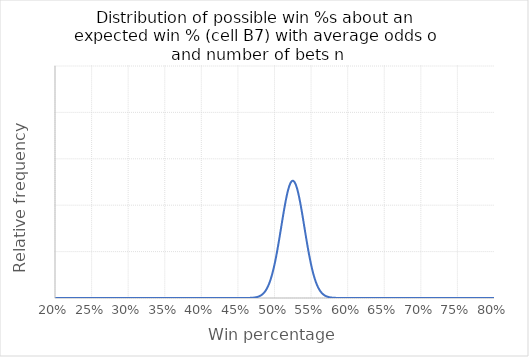
| Category | Probability mass function |
|---|---|
| 0.0 | 0 |
| 0.001 | 0 |
| 0.002 | 0 |
| 0.003 | 0 |
| 0.004 | 0 |
| 0.005 | 0 |
| 0.006 | 0 |
| 0.007 | 0 |
| 0.008 | 0 |
| 0.009000000000000001 | 0 |
| 0.010000000000000002 | 0 |
| 0.011000000000000003 | 0 |
| 0.012000000000000004 | 0 |
| 0.013000000000000005 | 0 |
| 0.014000000000000005 | 0 |
| 0.015000000000000006 | 0 |
| 0.016000000000000007 | 0 |
| 0.017000000000000008 | 0 |
| 0.01800000000000001 | 0 |
| 0.01900000000000001 | 0 |
| 0.02000000000000001 | 0 |
| 0.02100000000000001 | 0 |
| 0.022000000000000013 | 0 |
| 0.023000000000000013 | 0 |
| 0.024000000000000014 | 0 |
| 0.025000000000000015 | 0 |
| 0.026000000000000016 | 0 |
| 0.027000000000000017 | 0 |
| 0.028000000000000018 | 0 |
| 0.02900000000000002 | 0 |
| 0.03000000000000002 | 0 |
| 0.03100000000000002 | 0 |
| 0.03200000000000002 | 0 |
| 0.03300000000000002 | 0 |
| 0.03400000000000002 | 0 |
| 0.035000000000000024 | 0 |
| 0.036000000000000025 | 0 |
| 0.037000000000000026 | 0 |
| 0.03800000000000003 | 0 |
| 0.03900000000000003 | 0 |
| 0.04000000000000003 | 0 |
| 0.04100000000000003 | 0 |
| 0.04200000000000003 | 0 |
| 0.04300000000000003 | 0 |
| 0.04400000000000003 | 0 |
| 0.04500000000000003 | 0 |
| 0.046000000000000034 | 0 |
| 0.047000000000000035 | 0 |
| 0.048000000000000036 | 0 |
| 0.04900000000000004 | 0 |
| 0.05000000000000004 | 0 |
| 0.05100000000000004 | 0 |
| 0.05200000000000004 | 0 |
| 0.05300000000000004 | 0 |
| 0.05400000000000004 | 0 |
| 0.05500000000000004 | 0 |
| 0.05600000000000004 | 0 |
| 0.057000000000000044 | 0 |
| 0.058000000000000045 | 0 |
| 0.059000000000000045 | 0 |
| 0.060000000000000046 | 0 |
| 0.06100000000000005 | 0 |
| 0.06200000000000005 | 0 |
| 0.06300000000000004 | 0 |
| 0.06400000000000004 | 0 |
| 0.06500000000000004 | 0 |
| 0.06600000000000004 | 0 |
| 0.06700000000000005 | 0 |
| 0.06800000000000005 | 0 |
| 0.06900000000000005 | 0 |
| 0.07000000000000005 | 0 |
| 0.07100000000000005 | 0 |
| 0.07200000000000005 | 0 |
| 0.07300000000000005 | 0 |
| 0.07400000000000005 | 0 |
| 0.07500000000000005 | 0 |
| 0.07600000000000005 | 0 |
| 0.07700000000000005 | 0 |
| 0.07800000000000006 | 0 |
| 0.07900000000000006 | 0 |
| 0.08000000000000006 | 0 |
| 0.08100000000000006 | 0 |
| 0.08200000000000006 | 0 |
| 0.08300000000000006 | 0 |
| 0.08400000000000006 | 0 |
| 0.08500000000000006 | 0 |
| 0.08600000000000006 | 0 |
| 0.08700000000000006 | 0 |
| 0.08800000000000006 | 0 |
| 0.08900000000000007 | 0 |
| 0.09000000000000007 | 0 |
| 0.09100000000000007 | 0 |
| 0.09200000000000007 | 0 |
| 0.09300000000000007 | 0 |
| 0.09400000000000007 | 0 |
| 0.09500000000000007 | 0 |
| 0.09600000000000007 | 0 |
| 0.09700000000000007 | 0 |
| 0.09800000000000007 | 0 |
| 0.09900000000000007 | 0 |
| 0.10000000000000007 | 0 |
| 0.10100000000000008 | 0 |
| 0.10200000000000008 | 0 |
| 0.10300000000000008 | 0 |
| 0.10400000000000008 | 0 |
| 0.10500000000000008 | 0 |
| 0.10600000000000008 | 0 |
| 0.10700000000000008 | 0 |
| 0.10800000000000008 | 0 |
| 0.10900000000000008 | 0 |
| 0.11000000000000008 | 0 |
| 0.11100000000000008 | 0 |
| 0.11200000000000009 | 0 |
| 0.11300000000000009 | 0 |
| 0.11400000000000009 | 0 |
| 0.11500000000000009 | 0 |
| 0.11600000000000009 | 0 |
| 0.11700000000000009 | 0 |
| 0.11800000000000009 | 0 |
| 0.11900000000000009 | 0 |
| 0.12000000000000009 | 0 |
| 0.1210000000000001 | 0 |
| 0.1220000000000001 | 0 |
| 0.1230000000000001 | 0 |
| 0.1240000000000001 | 0 |
| 0.12500000000000008 | 0 |
| 0.12600000000000008 | 0 |
| 0.12700000000000009 | 0 |
| 0.12800000000000009 | 0 |
| 0.1290000000000001 | 0 |
| 0.1300000000000001 | 0 |
| 0.1310000000000001 | 0 |
| 0.1320000000000001 | 0 |
| 0.1330000000000001 | 0 |
| 0.1340000000000001 | 0 |
| 0.1350000000000001 | 0 |
| 0.1360000000000001 | 0 |
| 0.1370000000000001 | 0 |
| 0.1380000000000001 | 0 |
| 0.1390000000000001 | 0 |
| 0.1400000000000001 | 0 |
| 0.1410000000000001 | 0 |
| 0.1420000000000001 | 0 |
| 0.1430000000000001 | 0 |
| 0.1440000000000001 | 0 |
| 0.1450000000000001 | 0 |
| 0.1460000000000001 | 0 |
| 0.1470000000000001 | 0 |
| 0.1480000000000001 | 0 |
| 0.1490000000000001 | 0 |
| 0.1500000000000001 | 0 |
| 0.1510000000000001 | 0 |
| 0.1520000000000001 | 0 |
| 0.1530000000000001 | 0 |
| 0.1540000000000001 | 0 |
| 0.1550000000000001 | 0 |
| 0.1560000000000001 | 0 |
| 0.1570000000000001 | 0 |
| 0.1580000000000001 | 0 |
| 0.1590000000000001 | 0 |
| 0.16000000000000011 | 0 |
| 0.16100000000000012 | 0 |
| 0.16200000000000012 | 0 |
| 0.16300000000000012 | 0 |
| 0.16400000000000012 | 0 |
| 0.16500000000000012 | 0 |
| 0.16600000000000012 | 0 |
| 0.16700000000000012 | 0 |
| 0.16800000000000012 | 0 |
| 0.16900000000000012 | 0 |
| 0.17000000000000012 | 0 |
| 0.17100000000000012 | 0 |
| 0.17200000000000013 | 0 |
| 0.17300000000000013 | 0 |
| 0.17400000000000013 | 0 |
| 0.17500000000000013 | 0 |
| 0.17600000000000013 | 0 |
| 0.17700000000000013 | 0 |
| 0.17800000000000013 | 0 |
| 0.17900000000000013 | 0 |
| 0.18000000000000013 | 0 |
| 0.18100000000000013 | 0 |
| 0.18200000000000013 | 0 |
| 0.18300000000000013 | 0 |
| 0.18400000000000014 | 0 |
| 0.18500000000000014 | 0 |
| 0.18600000000000014 | 0 |
| 0.18700000000000014 | 0 |
| 0.18800000000000014 | 0 |
| 0.18900000000000014 | 0 |
| 0.19000000000000014 | 0 |
| 0.19100000000000014 | 0 |
| 0.19200000000000014 | 0 |
| 0.19300000000000014 | 0 |
| 0.19400000000000014 | 0 |
| 0.19500000000000015 | 0 |
| 0.19600000000000015 | 0 |
| 0.19700000000000015 | 0 |
| 0.19800000000000015 | 0 |
| 0.19900000000000015 | 0 |
| 0.20000000000000015 | 0 |
| 0.20100000000000015 | 0 |
| 0.20200000000000015 | 0 |
| 0.20300000000000015 | 0 |
| 0.20400000000000015 | 0 |
| 0.20500000000000015 | 0 |
| 0.20600000000000016 | 0 |
| 0.20700000000000016 | 0 |
| 0.20800000000000016 | 0 |
| 0.20900000000000016 | 0 |
| 0.21000000000000016 | 0 |
| 0.21100000000000016 | 0 |
| 0.21200000000000016 | 0 |
| 0.21300000000000016 | 0 |
| 0.21400000000000016 | 0 |
| 0.21500000000000016 | 0 |
| 0.21600000000000016 | 0 |
| 0.21700000000000016 | 0 |
| 0.21800000000000017 | 0 |
| 0.21900000000000017 | 0 |
| 0.22000000000000017 | 0 |
| 0.22100000000000017 | 0 |
| 0.22200000000000017 | 0 |
| 0.22300000000000017 | 0 |
| 0.22400000000000017 | 0 |
| 0.22500000000000017 | 0 |
| 0.22600000000000017 | 0 |
| 0.22700000000000017 | 0 |
| 0.22800000000000017 | 0 |
| 0.22900000000000018 | 0 |
| 0.23000000000000018 | 0 |
| 0.23100000000000018 | 0 |
| 0.23200000000000018 | 0 |
| 0.23300000000000018 | 0 |
| 0.23400000000000018 | 0 |
| 0.23500000000000018 | 0 |
| 0.23600000000000018 | 0 |
| 0.23700000000000018 | 0 |
| 0.23800000000000018 | 0 |
| 0.23900000000000018 | 0 |
| 0.24000000000000019 | 0 |
| 0.2410000000000002 | 0 |
| 0.2420000000000002 | 0 |
| 0.2430000000000002 | 0 |
| 0.2440000000000002 | 0 |
| 0.2450000000000002 | 0 |
| 0.2460000000000002 | 0 |
| 0.2470000000000002 | 0 |
| 0.2480000000000002 | 0 |
| 0.2490000000000002 | 0 |
| 0.25000000000000017 | 0 |
| 0.25100000000000017 | 0 |
| 0.25200000000000017 | 0 |
| 0.25300000000000017 | 0 |
| 0.25400000000000017 | 0 |
| 0.25500000000000017 | 0 |
| 0.25600000000000017 | 0 |
| 0.2570000000000002 | 0 |
| 0.2580000000000002 | 0 |
| 0.2590000000000002 | 0 |
| 0.2600000000000002 | 0 |
| 0.2610000000000002 | 0 |
| 0.2620000000000002 | 0 |
| 0.2630000000000002 | 0 |
| 0.2640000000000002 | 0 |
| 0.2650000000000002 | 0 |
| 0.2660000000000002 | 0 |
| 0.2670000000000002 | 0 |
| 0.2680000000000002 | 0 |
| 0.2690000000000002 | 0 |
| 0.2700000000000002 | 0 |
| 0.2710000000000002 | 0 |
| 0.2720000000000002 | 0 |
| 0.2730000000000002 | 0 |
| 0.2740000000000002 | 0 |
| 0.2750000000000002 | 0 |
| 0.2760000000000002 | 0 |
| 0.2770000000000002 | 0 |
| 0.2780000000000002 | 0 |
| 0.2790000000000002 | 0 |
| 0.2800000000000002 | 0 |
| 0.2810000000000002 | 0 |
| 0.2820000000000002 | 0 |
| 0.2830000000000002 | 0 |
| 0.2840000000000002 | 0 |
| 0.2850000000000002 | 0 |
| 0.2860000000000002 | 0 |
| 0.2870000000000002 | 0 |
| 0.2880000000000002 | 0 |
| 0.2890000000000002 | 0 |
| 0.2900000000000002 | 0 |
| 0.2910000000000002 | 0 |
| 0.2920000000000002 | 0 |
| 0.2930000000000002 | 0 |
| 0.2940000000000002 | 0 |
| 0.2950000000000002 | 0 |
| 0.2960000000000002 | 0 |
| 0.2970000000000002 | 0 |
| 0.2980000000000002 | 0 |
| 0.2990000000000002 | 0 |
| 0.3000000000000002 | 0 |
| 0.3010000000000002 | 0 |
| 0.3020000000000002 | 0 |
| 0.3030000000000002 | 0 |
| 0.3040000000000002 | 0 |
| 0.3050000000000002 | 0 |
| 0.3060000000000002 | 0 |
| 0.3070000000000002 | 0 |
| 0.3080000000000002 | 0 |
| 0.3090000000000002 | 0 |
| 0.3100000000000002 | 0 |
| 0.3110000000000002 | 0 |
| 0.3120000000000002 | 0 |
| 0.3130000000000002 | 0 |
| 0.3140000000000002 | 0 |
| 0.3150000000000002 | 0 |
| 0.3160000000000002 | 0 |
| 0.3170000000000002 | 0 |
| 0.3180000000000002 | 0 |
| 0.31900000000000023 | 0 |
| 0.32000000000000023 | 0 |
| 0.32100000000000023 | 0 |
| 0.32200000000000023 | 0 |
| 0.32300000000000023 | 0 |
| 0.32400000000000023 | 0 |
| 0.32500000000000023 | 0 |
| 0.32600000000000023 | 0 |
| 0.32700000000000023 | 0 |
| 0.32800000000000024 | 0 |
| 0.32900000000000024 | 0 |
| 0.33000000000000024 | 0 |
| 0.33100000000000024 | 0 |
| 0.33200000000000024 | 0 |
| 0.33300000000000024 | 0 |
| 0.33400000000000024 | 0 |
| 0.33500000000000024 | 0 |
| 0.33600000000000024 | 0 |
| 0.33700000000000024 | 0 |
| 0.33800000000000024 | 0 |
| 0.33900000000000025 | 0 |
| 0.34000000000000025 | 0 |
| 0.34100000000000025 | 0 |
| 0.34200000000000025 | 0 |
| 0.34300000000000025 | 0 |
| 0.34400000000000025 | 0 |
| 0.34500000000000025 | 0 |
| 0.34600000000000025 | 0 |
| 0.34700000000000025 | 0 |
| 0.34800000000000025 | 0 |
| 0.34900000000000025 | 0 |
| 0.35000000000000026 | 0 |
| 0.35100000000000026 | 0 |
| 0.35200000000000026 | 0 |
| 0.35300000000000026 | 0 |
| 0.35400000000000026 | 0 |
| 0.35500000000000026 | 0 |
| 0.35600000000000026 | 0 |
| 0.35700000000000026 | 0 |
| 0.35800000000000026 | 0 |
| 0.35900000000000026 | 0 |
| 0.36000000000000026 | 0 |
| 0.36100000000000027 | 0 |
| 0.36200000000000027 | 0 |
| 0.36300000000000027 | 0 |
| 0.36400000000000027 | 0 |
| 0.36500000000000027 | 0 |
| 0.36600000000000027 | 0 |
| 0.36700000000000027 | 0 |
| 0.36800000000000027 | 0 |
| 0.36900000000000027 | 0 |
| 0.3700000000000003 | 0 |
| 0.3710000000000003 | 0 |
| 0.3720000000000003 | 0 |
| 0.3730000000000003 | 0 |
| 0.3740000000000003 | 0 |
| 0.3750000000000003 | 0 |
| 0.3760000000000003 | 0 |
| 0.3770000000000003 | 0 |
| 0.3780000000000003 | 0 |
| 0.3790000000000003 | 0 |
| 0.3800000000000003 | 0 |
| 0.3810000000000003 | 0 |
| 0.3820000000000003 | 0 |
| 0.3830000000000003 | 0 |
| 0.3840000000000003 | 0 |
| 0.3850000000000003 | 0 |
| 0.3860000000000003 | 0 |
| 0.3870000000000003 | 0 |
| 0.3880000000000003 | 0 |
| 0.3890000000000003 | 0 |
| 0.3900000000000003 | 0 |
| 0.3910000000000003 | 0 |
| 0.3920000000000003 | 0 |
| 0.3930000000000003 | 0 |
| 0.3940000000000003 | 0 |
| 0.3950000000000003 | 0 |
| 0.3960000000000003 | 0 |
| 0.3970000000000003 | 0 |
| 0.3980000000000003 | 0 |
| 0.3990000000000003 | 0 |
| 0.4000000000000003 | 0 |
| 0.4010000000000003 | 0 |
| 0.4020000000000003 | 0 |
| 0.4030000000000003 | 0 |
| 0.4040000000000003 | 0 |
| 0.4050000000000003 | 0 |
| 0.4060000000000003 | 0 |
| 0.4070000000000003 | 0 |
| 0.4080000000000003 | 0 |
| 0.4090000000000003 | 0 |
| 0.4100000000000003 | 0 |
| 0.4110000000000003 | 0 |
| 0.4120000000000003 | 0 |
| 0.4130000000000003 | 0 |
| 0.4140000000000003 | 0 |
| 0.4150000000000003 | 0 |
| 0.4160000000000003 | 0 |
| 0.4170000000000003 | 0 |
| 0.4180000000000003 | 0 |
| 0.4190000000000003 | 0 |
| 0.4200000000000003 | 0 |
| 0.4210000000000003 | 0 |
| 0.4220000000000003 | 0 |
| 0.4230000000000003 | 0 |
| 0.4240000000000003 | 0 |
| 0.4250000000000003 | 0 |
| 0.4260000000000003 | 0 |
| 0.4270000000000003 | 0 |
| 0.4280000000000003 | 0 |
| 0.4290000000000003 | 0 |
| 0.4300000000000003 | 0 |
| 0.4310000000000003 | 0 |
| 0.43200000000000033 | 0 |
| 0.43300000000000033 | 0 |
| 0.43400000000000033 | 0 |
| 0.43500000000000033 | 0 |
| 0.43600000000000033 | 0 |
| 0.43700000000000033 | 0 |
| 0.43800000000000033 | 0 |
| 0.43900000000000033 | 0 |
| 0.44000000000000034 | 0 |
| 0.44100000000000034 | 0 |
| 0.44200000000000034 | 0 |
| 0.44300000000000034 | 0 |
| 0.44400000000000034 | 0 |
| 0.44500000000000034 | 0 |
| 0.44600000000000034 | 0 |
| 0.44700000000000034 | 0 |
| 0.44800000000000034 | 0 |
| 0.44900000000000034 | 0 |
| 0.45000000000000034 | 0 |
| 0.45100000000000035 | 0 |
| 0.45200000000000035 | 0 |
| 0.45300000000000035 | 0 |
| 0.45400000000000035 | 0 |
| 0.45500000000000035 | 0 |
| 0.45600000000000035 | 0 |
| 0.45700000000000035 | 0 |
| 0.45800000000000035 | 0 |
| 0.45900000000000035 | 0 |
| 0.46000000000000035 | 0 |
| 0.46100000000000035 | 0 |
| 0.46200000000000035 | 0 |
| 0.46300000000000036 | 0 |
| 0.46400000000000036 | 0 |
| 0.46500000000000036 | 0 |
| 0.46600000000000036 | 0 |
| 0.46700000000000036 | 0 |
| 0.46800000000000036 | 0 |
| 0.46900000000000036 | 0 |
| 0.47000000000000036 | 0 |
| 0.47100000000000036 | 0 |
| 0.47200000000000036 | 0 |
| 0.47300000000000036 | 0 |
| 0.47400000000000037 | 0 |
| 0.47500000000000037 | 0 |
| 0.47600000000000037 | 0 |
| 0.47700000000000037 | 0 |
| 0.47800000000000037 | 0 |
| 0.47900000000000037 | 0 |
| 0.48000000000000037 | 0 |
| 0.48100000000000037 | 0.001 |
| 0.4820000000000004 | 0.001 |
| 0.4830000000000004 | 0.001 |
| 0.4840000000000004 | 0.001 |
| 0.4850000000000004 | 0.001 |
| 0.4860000000000004 | 0.001 |
| 0.4870000000000004 | 0.001 |
| 0.4880000000000004 | 0.002 |
| 0.4890000000000004 | 0.002 |
| 0.4900000000000004 | 0.002 |
| 0.4910000000000004 | 0.002 |
| 0.4920000000000004 | 0.003 |
| 0.4930000000000004 | 0.003 |
| 0.4940000000000004 | 0.004 |
| 0.4950000000000004 | 0.004 |
| 0.4960000000000004 | 0.005 |
| 0.4970000000000004 | 0.005 |
| 0.4980000000000004 | 0.006 |
| 0.4990000000000004 | 0.007 |
| 0.5000000000000003 | 0.007 |
| 0.5010000000000003 | 0.008 |
| 0.5020000000000003 | 0.009 |
| 0.5030000000000003 | 0.01 |
| 0.5040000000000003 | 0.01 |
| 0.5050000000000003 | 0.011 |
| 0.5060000000000003 | 0.012 |
| 0.5070000000000003 | 0.013 |
| 0.5080000000000003 | 0.014 |
| 0.5090000000000003 | 0.015 |
| 0.5100000000000003 | 0.016 |
| 0.5110000000000003 | 0.017 |
| 0.5120000000000003 | 0.018 |
| 0.5130000000000003 | 0.019 |
| 0.5140000000000003 | 0.02 |
| 0.5150000000000003 | 0.021 |
| 0.5160000000000003 | 0.021 |
| 0.5170000000000003 | 0.022 |
| 0.5180000000000003 | 0.023 |
| 0.5190000000000003 | 0.024 |
| 0.5200000000000004 | 0.024 |
| 0.5210000000000004 | 0.024 |
| 0.5220000000000004 | 0.025 |
| 0.5230000000000004 | 0.025 |
| 0.5240000000000004 | 0.025 |
| 0.5250000000000004 | 0.025 |
| 0.5260000000000004 | 0.025 |
| 0.5270000000000004 | 0.025 |
| 0.5280000000000004 | 0.025 |
| 0.5290000000000004 | 0.024 |
| 0.5300000000000004 | 0.024 |
| 0.5310000000000004 | 0.024 |
| 0.5320000000000004 | 0.023 |
| 0.5330000000000004 | 0.022 |
| 0.5340000000000004 | 0.021 |
| 0.5350000000000004 | 0.021 |
| 0.5360000000000004 | 0.02 |
| 0.5370000000000004 | 0.019 |
| 0.5380000000000004 | 0.018 |
| 0.5390000000000004 | 0.017 |
| 0.5400000000000004 | 0.016 |
| 0.5410000000000004 | 0.015 |
| 0.5420000000000004 | 0.014 |
| 0.5430000000000004 | 0.013 |
| 0.5440000000000004 | 0.012 |
| 0.5450000000000004 | 0.011 |
| 0.5460000000000004 | 0.01 |
| 0.5470000000000004 | 0.01 |
| 0.5480000000000004 | 0.009 |
| 0.5490000000000004 | 0.008 |
| 0.5500000000000004 | 0.007 |
| 0.5510000000000004 | 0.007 |
| 0.5520000000000004 | 0.006 |
| 0.5530000000000004 | 0.005 |
| 0.5540000000000004 | 0.005 |
| 0.5550000000000004 | 0.004 |
| 0.5560000000000004 | 0.004 |
| 0.5570000000000004 | 0.003 |
| 0.5580000000000004 | 0.003 |
| 0.5590000000000004 | 0.002 |
| 0.5600000000000004 | 0.002 |
| 0.5610000000000004 | 0.002 |
| 0.5620000000000004 | 0.002 |
| 0.5630000000000004 | 0.001 |
| 0.5640000000000004 | 0.001 |
| 0.5650000000000004 | 0.001 |
| 0.5660000000000004 | 0.001 |
| 0.5670000000000004 | 0.001 |
| 0.5680000000000004 | 0.001 |
| 0.5690000000000004 | 0.001 |
| 0.5700000000000004 | 0 |
| 0.5710000000000004 | 0 |
| 0.5720000000000004 | 0 |
| 0.5730000000000004 | 0 |
| 0.5740000000000004 | 0 |
| 0.5750000000000004 | 0 |
| 0.5760000000000004 | 0 |
| 0.5770000000000004 | 0 |
| 0.5780000000000004 | 0 |
| 0.5790000000000004 | 0 |
| 0.5800000000000004 | 0 |
| 0.5810000000000004 | 0 |
| 0.5820000000000004 | 0 |
| 0.5830000000000004 | 0 |
| 0.5840000000000004 | 0 |
| 0.5850000000000004 | 0 |
| 0.5860000000000004 | 0 |
| 0.5870000000000004 | 0 |
| 0.5880000000000004 | 0 |
| 0.5890000000000004 | 0 |
| 0.5900000000000004 | 0 |
| 0.5910000000000004 | 0 |
| 0.5920000000000004 | 0 |
| 0.5930000000000004 | 0 |
| 0.5940000000000004 | 0 |
| 0.5950000000000004 | 0 |
| 0.5960000000000004 | 0 |
| 0.5970000000000004 | 0 |
| 0.5980000000000004 | 0 |
| 0.5990000000000004 | 0 |
| 0.6000000000000004 | 0 |
| 0.6010000000000004 | 0 |
| 0.6020000000000004 | 0 |
| 0.6030000000000004 | 0 |
| 0.6040000000000004 | 0 |
| 0.6050000000000004 | 0 |
| 0.6060000000000004 | 0 |
| 0.6070000000000004 | 0 |
| 0.6080000000000004 | 0 |
| 0.6090000000000004 | 0 |
| 0.6100000000000004 | 0 |
| 0.6110000000000004 | 0 |
| 0.6120000000000004 | 0 |
| 0.6130000000000004 | 0 |
| 0.6140000000000004 | 0 |
| 0.6150000000000004 | 0 |
| 0.6160000000000004 | 0 |
| 0.6170000000000004 | 0 |
| 0.6180000000000004 | 0 |
| 0.6190000000000004 | 0 |
| 0.6200000000000004 | 0 |
| 0.6210000000000004 | 0 |
| 0.6220000000000004 | 0 |
| 0.6230000000000004 | 0 |
| 0.6240000000000004 | 0 |
| 0.6250000000000004 | 0 |
| 0.6260000000000004 | 0 |
| 0.6270000000000004 | 0 |
| 0.6280000000000004 | 0 |
| 0.6290000000000004 | 0 |
| 0.6300000000000004 | 0 |
| 0.6310000000000004 | 0 |
| 0.6320000000000005 | 0 |
| 0.6330000000000005 | 0 |
| 0.6340000000000005 | 0 |
| 0.6350000000000005 | 0 |
| 0.6360000000000005 | 0 |
| 0.6370000000000005 | 0 |
| 0.6380000000000005 | 0 |
| 0.6390000000000005 | 0 |
| 0.6400000000000005 | 0 |
| 0.6410000000000005 | 0 |
| 0.6420000000000005 | 0 |
| 0.6430000000000005 | 0 |
| 0.6440000000000005 | 0 |
| 0.6450000000000005 | 0 |
| 0.6460000000000005 | 0 |
| 0.6470000000000005 | 0 |
| 0.6480000000000005 | 0 |
| 0.6490000000000005 | 0 |
| 0.6500000000000005 | 0 |
| 0.6510000000000005 | 0 |
| 0.6520000000000005 | 0 |
| 0.6530000000000005 | 0 |
| 0.6540000000000005 | 0 |
| 0.6550000000000005 | 0 |
| 0.6560000000000005 | 0 |
| 0.6570000000000005 | 0 |
| 0.6580000000000005 | 0 |
| 0.6590000000000005 | 0 |
| 0.6600000000000005 | 0 |
| 0.6610000000000005 | 0 |
| 0.6620000000000005 | 0 |
| 0.6630000000000005 | 0 |
| 0.6640000000000005 | 0 |
| 0.6650000000000005 | 0 |
| 0.6660000000000005 | 0 |
| 0.6670000000000005 | 0 |
| 0.6680000000000005 | 0 |
| 0.6690000000000005 | 0 |
| 0.6700000000000005 | 0 |
| 0.6710000000000005 | 0 |
| 0.6720000000000005 | 0 |
| 0.6730000000000005 | 0 |
| 0.6740000000000005 | 0 |
| 0.6750000000000005 | 0 |
| 0.6760000000000005 | 0 |
| 0.6770000000000005 | 0 |
| 0.6780000000000005 | 0 |
| 0.6790000000000005 | 0 |
| 0.6800000000000005 | 0 |
| 0.6810000000000005 | 0 |
| 0.6820000000000005 | 0 |
| 0.6830000000000005 | 0 |
| 0.6840000000000005 | 0 |
| 0.6850000000000005 | 0 |
| 0.6860000000000005 | 0 |
| 0.6870000000000005 | 0 |
| 0.6880000000000005 | 0 |
| 0.6890000000000005 | 0 |
| 0.6900000000000005 | 0 |
| 0.6910000000000005 | 0 |
| 0.6920000000000005 | 0 |
| 0.6930000000000005 | 0 |
| 0.6940000000000005 | 0 |
| 0.6950000000000005 | 0 |
| 0.6960000000000005 | 0 |
| 0.6970000000000005 | 0 |
| 0.6980000000000005 | 0 |
| 0.6990000000000005 | 0 |
| 0.7000000000000005 | 0 |
| 0.7010000000000005 | 0 |
| 0.7020000000000005 | 0 |
| 0.7030000000000005 | 0 |
| 0.7040000000000005 | 0 |
| 0.7050000000000005 | 0 |
| 0.7060000000000005 | 0 |
| 0.7070000000000005 | 0 |
| 0.7080000000000005 | 0 |
| 0.7090000000000005 | 0 |
| 0.7100000000000005 | 0 |
| 0.7110000000000005 | 0 |
| 0.7120000000000005 | 0 |
| 0.7130000000000005 | 0 |
| 0.7140000000000005 | 0 |
| 0.7150000000000005 | 0 |
| 0.7160000000000005 | 0 |
| 0.7170000000000005 | 0 |
| 0.7180000000000005 | 0 |
| 0.7190000000000005 | 0 |
| 0.7200000000000005 | 0 |
| 0.7210000000000005 | 0 |
| 0.7220000000000005 | 0 |
| 0.7230000000000005 | 0 |
| 0.7240000000000005 | 0 |
| 0.7250000000000005 | 0 |
| 0.7260000000000005 | 0 |
| 0.7270000000000005 | 0 |
| 0.7280000000000005 | 0 |
| 0.7290000000000005 | 0 |
| 0.7300000000000005 | 0 |
| 0.7310000000000005 | 0 |
| 0.7320000000000005 | 0 |
| 0.7330000000000005 | 0 |
| 0.7340000000000005 | 0 |
| 0.7350000000000005 | 0 |
| 0.7360000000000005 | 0 |
| 0.7370000000000005 | 0 |
| 0.7380000000000005 | 0 |
| 0.7390000000000005 | 0 |
| 0.7400000000000005 | 0 |
| 0.7410000000000005 | 0 |
| 0.7420000000000005 | 0 |
| 0.7430000000000005 | 0 |
| 0.7440000000000005 | 0 |
| 0.7450000000000006 | 0 |
| 0.7460000000000006 | 0 |
| 0.7470000000000006 | 0 |
| 0.7480000000000006 | 0 |
| 0.7490000000000006 | 0 |
| 0.7500000000000006 | 0 |
| 0.7510000000000006 | 0 |
| 0.7520000000000006 | 0 |
| 0.7530000000000006 | 0 |
| 0.7540000000000006 | 0 |
| 0.7550000000000006 | 0 |
| 0.7560000000000006 | 0 |
| 0.7570000000000006 | 0 |
| 0.7580000000000006 | 0 |
| 0.7590000000000006 | 0 |
| 0.7600000000000006 | 0 |
| 0.7610000000000006 | 0 |
| 0.7620000000000006 | 0 |
| 0.7630000000000006 | 0 |
| 0.7640000000000006 | 0 |
| 0.7650000000000006 | 0 |
| 0.7660000000000006 | 0 |
| 0.7670000000000006 | 0 |
| 0.7680000000000006 | 0 |
| 0.7690000000000006 | 0 |
| 0.7700000000000006 | 0 |
| 0.7710000000000006 | 0 |
| 0.7720000000000006 | 0 |
| 0.7730000000000006 | 0 |
| 0.7740000000000006 | 0 |
| 0.7750000000000006 | 0 |
| 0.7760000000000006 | 0 |
| 0.7770000000000006 | 0 |
| 0.7780000000000006 | 0 |
| 0.7790000000000006 | 0 |
| 0.7800000000000006 | 0 |
| 0.7810000000000006 | 0 |
| 0.7820000000000006 | 0 |
| 0.7830000000000006 | 0 |
| 0.7840000000000006 | 0 |
| 0.7850000000000006 | 0 |
| 0.7860000000000006 | 0 |
| 0.7870000000000006 | 0 |
| 0.7880000000000006 | 0 |
| 0.7890000000000006 | 0 |
| 0.7900000000000006 | 0 |
| 0.7910000000000006 | 0 |
| 0.7920000000000006 | 0 |
| 0.7930000000000006 | 0 |
| 0.7940000000000006 | 0 |
| 0.7950000000000006 | 0 |
| 0.7960000000000006 | 0 |
| 0.7970000000000006 | 0 |
| 0.7980000000000006 | 0 |
| 0.7990000000000006 | 0 |
| 0.8000000000000006 | 0 |
| 0.8010000000000006 | 0 |
| 0.8020000000000006 | 0 |
| 0.8030000000000006 | 0 |
| 0.8040000000000006 | 0 |
| 0.8050000000000006 | 0 |
| 0.8060000000000006 | 0 |
| 0.8070000000000006 | 0 |
| 0.8080000000000006 | 0 |
| 0.8090000000000006 | 0 |
| 0.8100000000000006 | 0 |
| 0.8110000000000006 | 0 |
| 0.8120000000000006 | 0 |
| 0.8130000000000006 | 0 |
| 0.8140000000000006 | 0 |
| 0.8150000000000006 | 0 |
| 0.8160000000000006 | 0 |
| 0.8170000000000006 | 0 |
| 0.8180000000000006 | 0 |
| 0.8190000000000006 | 0 |
| 0.8200000000000006 | 0 |
| 0.8210000000000006 | 0 |
| 0.8220000000000006 | 0 |
| 0.8230000000000006 | 0 |
| 0.8240000000000006 | 0 |
| 0.8250000000000006 | 0 |
| 0.8260000000000006 | 0 |
| 0.8270000000000006 | 0 |
| 0.8280000000000006 | 0 |
| 0.8290000000000006 | 0 |
| 0.8300000000000006 | 0 |
| 0.8310000000000006 | 0 |
| 0.8320000000000006 | 0 |
| 0.8330000000000006 | 0 |
| 0.8340000000000006 | 0 |
| 0.8350000000000006 | 0 |
| 0.8360000000000006 | 0 |
| 0.8370000000000006 | 0 |
| 0.8380000000000006 | 0 |
| 0.8390000000000006 | 0 |
| 0.8400000000000006 | 0 |
| 0.8410000000000006 | 0 |
| 0.8420000000000006 | 0 |
| 0.8430000000000006 | 0 |
| 0.8440000000000006 | 0 |
| 0.8450000000000006 | 0 |
| 0.8460000000000006 | 0 |
| 0.8470000000000006 | 0 |
| 0.8480000000000006 | 0 |
| 0.8490000000000006 | 0 |
| 0.8500000000000006 | 0 |
| 0.8510000000000006 | 0 |
| 0.8520000000000006 | 0 |
| 0.8530000000000006 | 0 |
| 0.8540000000000006 | 0 |
| 0.8550000000000006 | 0 |
| 0.8560000000000006 | 0 |
| 0.8570000000000007 | 0 |
| 0.8580000000000007 | 0 |
| 0.8590000000000007 | 0 |
| 0.8600000000000007 | 0 |
| 0.8610000000000007 | 0 |
| 0.8620000000000007 | 0 |
| 0.8630000000000007 | 0 |
| 0.8640000000000007 | 0 |
| 0.8650000000000007 | 0 |
| 0.8660000000000007 | 0 |
| 0.8670000000000007 | 0 |
| 0.8680000000000007 | 0 |
| 0.8690000000000007 | 0 |
| 0.8700000000000007 | 0 |
| 0.8710000000000007 | 0 |
| 0.8720000000000007 | 0 |
| 0.8730000000000007 | 0 |
| 0.8740000000000007 | 0 |
| 0.8750000000000007 | 0 |
| 0.8760000000000007 | 0 |
| 0.8770000000000007 | 0 |
| 0.8780000000000007 | 0 |
| 0.8790000000000007 | 0 |
| 0.8800000000000007 | 0 |
| 0.8810000000000007 | 0 |
| 0.8820000000000007 | 0 |
| 0.8830000000000007 | 0 |
| 0.8840000000000007 | 0 |
| 0.8850000000000007 | 0 |
| 0.8860000000000007 | 0 |
| 0.8870000000000007 | 0 |
| 0.8880000000000007 | 0 |
| 0.8890000000000007 | 0 |
| 0.8900000000000007 | 0 |
| 0.8910000000000007 | 0 |
| 0.8920000000000007 | 0 |
| 0.8930000000000007 | 0 |
| 0.8940000000000007 | 0 |
| 0.8950000000000007 | 0 |
| 0.8960000000000007 | 0 |
| 0.8970000000000007 | 0 |
| 0.8980000000000007 | 0 |
| 0.8990000000000007 | 0 |
| 0.9000000000000007 | 0 |
| 0.9010000000000007 | 0 |
| 0.9020000000000007 | 0 |
| 0.9030000000000007 | 0 |
| 0.9040000000000007 | 0 |
| 0.9050000000000007 | 0 |
| 0.9060000000000007 | 0 |
| 0.9070000000000007 | 0 |
| 0.9080000000000007 | 0 |
| 0.9090000000000007 | 0 |
| 0.9100000000000007 | 0 |
| 0.9110000000000007 | 0 |
| 0.9120000000000007 | 0 |
| 0.9130000000000007 | 0 |
| 0.9140000000000007 | 0 |
| 0.9150000000000007 | 0 |
| 0.9160000000000007 | 0 |
| 0.9170000000000007 | 0 |
| 0.9180000000000007 | 0 |
| 0.9190000000000007 | 0 |
| 0.9200000000000007 | 0 |
| 0.9210000000000007 | 0 |
| 0.9220000000000007 | 0 |
| 0.9230000000000007 | 0 |
| 0.9240000000000007 | 0 |
| 0.9250000000000007 | 0 |
| 0.9260000000000007 | 0 |
| 0.9270000000000007 | 0 |
| 0.9280000000000007 | 0 |
| 0.9290000000000007 | 0 |
| 0.9300000000000007 | 0 |
| 0.9310000000000007 | 0 |
| 0.9320000000000007 | 0 |
| 0.9330000000000007 | 0 |
| 0.9340000000000007 | 0 |
| 0.9350000000000007 | 0 |
| 0.9360000000000007 | 0 |
| 0.9370000000000007 | 0 |
| 0.9380000000000007 | 0 |
| 0.9390000000000007 | 0 |
| 0.9400000000000007 | 0 |
| 0.9410000000000007 | 0 |
| 0.9420000000000007 | 0 |
| 0.9430000000000007 | 0 |
| 0.9440000000000007 | 0 |
| 0.9450000000000007 | 0 |
| 0.9460000000000007 | 0 |
| 0.9470000000000007 | 0 |
| 0.9480000000000007 | 0 |
| 0.9490000000000007 | 0 |
| 0.9500000000000007 | 0 |
| 0.9510000000000007 | 0 |
| 0.9520000000000007 | 0 |
| 0.9530000000000007 | 0 |
| 0.9540000000000007 | 0 |
| 0.9550000000000007 | 0 |
| 0.9560000000000007 | 0 |
| 0.9570000000000007 | 0 |
| 0.9580000000000007 | 0 |
| 0.9590000000000007 | 0 |
| 0.9600000000000007 | 0 |
| 0.9610000000000007 | 0 |
| 0.9620000000000007 | 0 |
| 0.9630000000000007 | 0 |
| 0.9640000000000007 | 0 |
| 0.9650000000000007 | 0 |
| 0.9660000000000007 | 0 |
| 0.9670000000000007 | 0 |
| 0.9680000000000007 | 0 |
| 0.9690000000000007 | 0 |
| 0.9700000000000008 | 0 |
| 0.9710000000000008 | 0 |
| 0.9720000000000008 | 0 |
| 0.9730000000000008 | 0 |
| 0.9740000000000008 | 0 |
| 0.9750000000000008 | 0 |
| 0.9760000000000008 | 0 |
| 0.9770000000000008 | 0 |
| 0.9780000000000008 | 0 |
| 0.9790000000000008 | 0 |
| 0.9800000000000008 | 0 |
| 0.9810000000000008 | 0 |
| 0.9820000000000008 | 0 |
| 0.9830000000000008 | 0 |
| 0.9840000000000008 | 0 |
| 0.9850000000000008 | 0 |
| 0.9860000000000008 | 0 |
| 0.9870000000000008 | 0 |
| 0.9880000000000008 | 0 |
| 0.9890000000000008 | 0 |
| 0.9900000000000008 | 0 |
| 0.9910000000000008 | 0 |
| 0.9920000000000008 | 0 |
| 0.9930000000000008 | 0 |
| 0.9940000000000008 | 0 |
| 0.9950000000000008 | 0 |
| 0.9960000000000008 | 0 |
| 0.9970000000000008 | 0 |
| 0.9980000000000008 | 0 |
| 0.9990000000000008 | 0 |
| 1.0000000000000007 | 0 |